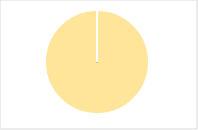
| Category | Total |
|---|---|
| Y | 0 |
| R | 0 |
| T | 0 |
| M | 0 |
| F | 0 |
| N | 35 |